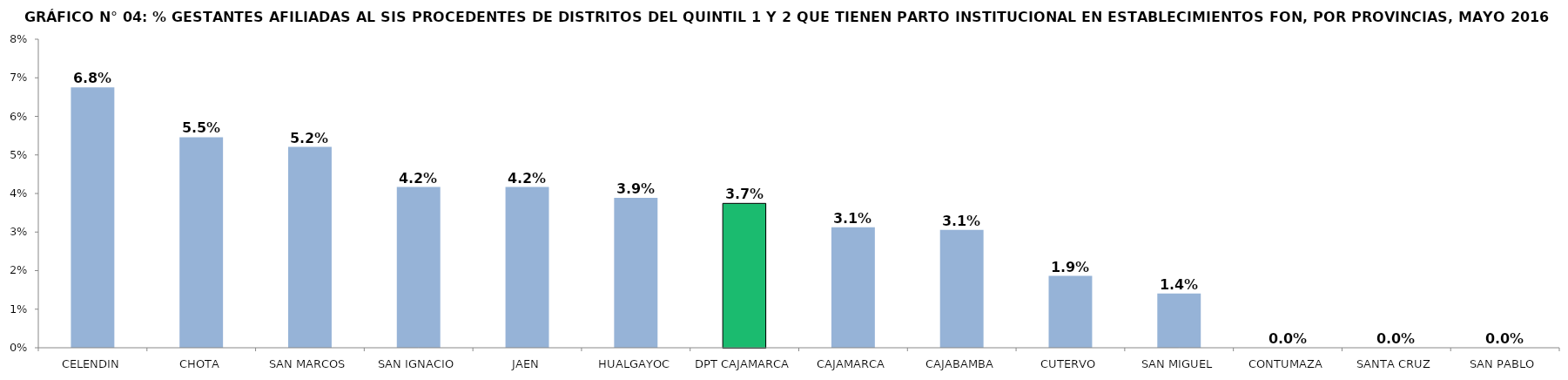
| Category | % GESTANTES AFILIADAS AL SIS PROCEDENTES DE DISTRITOS DEL QUINTIL 1 Y 2 QUE TIENEN PARTO INSTITUCIONAL EN ESTABLECIMIENTOS FON |
|---|---|
| CELENDIN | 0.068 |
| CHOTA | 0.055 |
| SAN MARCOS | 0.052 |
| SAN IGNACIO | 0.042 |
| JAEN | 0.042 |
| HUALGAYOC | 0.039 |
| DPT CAJAMARCA | 0.037 |
| CAJAMARCA | 0.031 |
| CAJABAMBA | 0.031 |
| CUTERVO | 0.019 |
| SAN MIGUEL | 0.014 |
| CONTUMAZA | 0 |
| SANTA CRUZ | 0 |
| SAN PABLO | 0 |